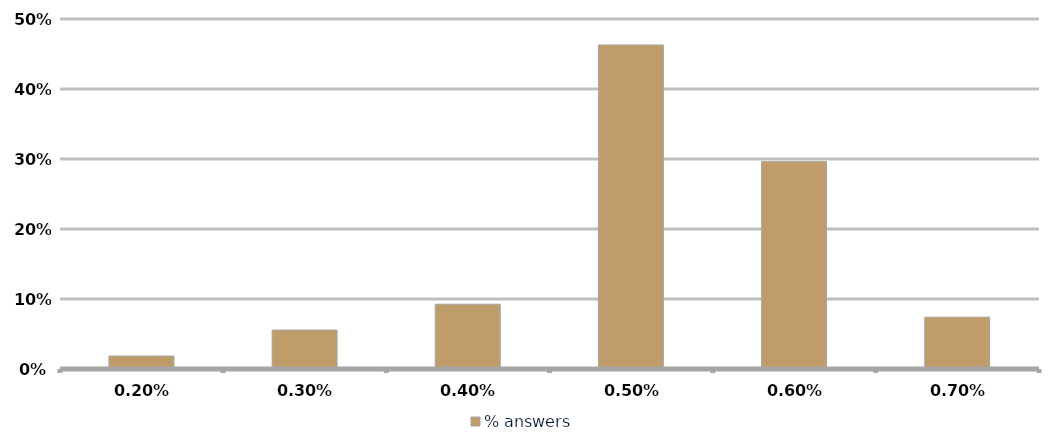
| Category | % answers |
|---|---|
| 0.002 | 0.019 |
| 0.003 | 0.056 |
| 0.004 | 0.093 |
| 0.005 | 0.463 |
| 0.006 | 0.296 |
| 0.007 | 0.074 |